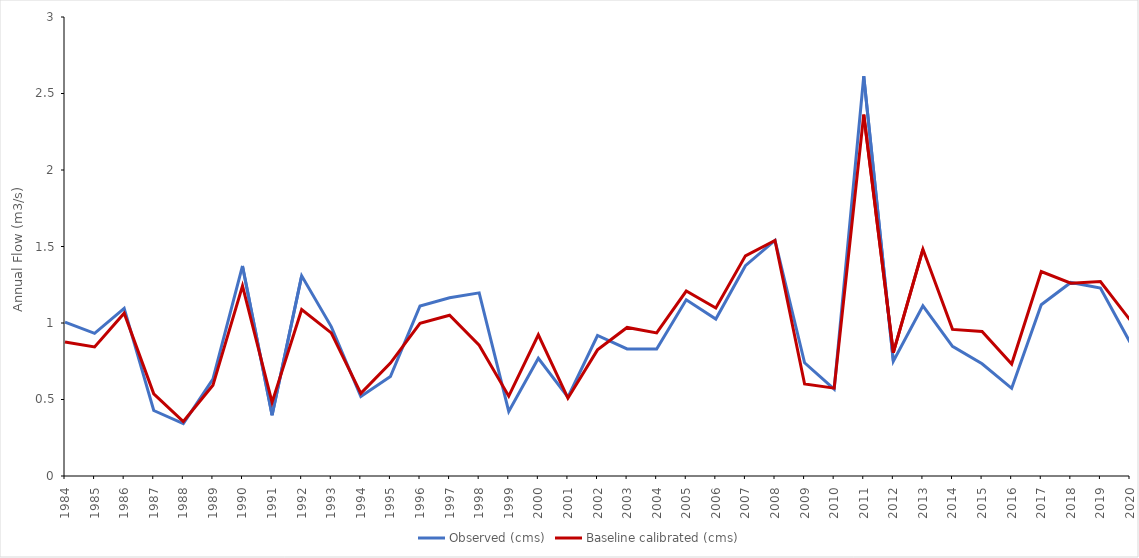
| Category | Observed (cms) | Baseline calibrated (cms) |
|---|---|---|
| 1984.0 | 1.006 | 0.876 |
| 1985.0 | 0.932 | 0.843 |
| 1986.0 | 1.095 | 1.064 |
| 1987.0 | 0.428 | 0.537 |
| 1988.0 | 0.342 | 0.356 |
| 1989.0 | 0.633 | 0.593 |
| 1990.0 | 1.373 | 1.243 |
| 1991.0 | 0.397 | 0.481 |
| 1992.0 | 1.308 | 1.088 |
| 1993.0 | 0.977 | 0.936 |
| 1994.0 | 0.519 | 0.54 |
| 1995.0 | 0.65 | 0.738 |
| 1996.0 | 1.111 | 0.997 |
| 1997.0 | 1.165 | 1.051 |
| 1998.0 | 1.197 | 0.854 |
| 1999.0 | 0.422 | 0.522 |
| 2000.0 | 0.769 | 0.923 |
| 2001.0 | 0.515 | 0.509 |
| 2002.0 | 0.918 | 0.824 |
| 2003.0 | 0.83 | 0.971 |
| 2004.0 | 0.83 | 0.935 |
| 2005.0 | 1.151 | 1.209 |
| 2006.0 | 1.026 | 1.098 |
| 2007.0 | 1.375 | 1.439 |
| 2008.0 | 1.54 | 1.54 |
| 2009.0 | 0.74 | 0.602 |
| 2010.0 | 0.568 | 0.574 |
| 2011.0 | 2.613 | 2.362 |
| 2012.0 | 0.75 | 0.807 |
| 2013.0 | 1.112 | 1.482 |
| 2014.0 | 0.848 | 0.958 |
| 2015.0 | 0.734 | 0.945 |
| 2016.0 | 0.573 | 0.732 |
| 2017.0 | 1.119 | 1.336 |
| 2018.0 | 1.265 | 1.26 |
| 2019.0 | 1.228 | 1.271 |
| 2020.0 | 0.874 | 1.02 |